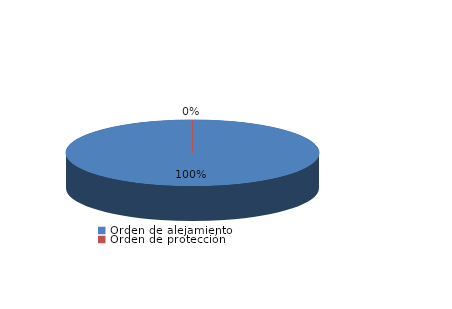
| Category | Series 0 |
|---|---|
| Orden de alejamiento | 1 |
| Orden de protección | 0 |